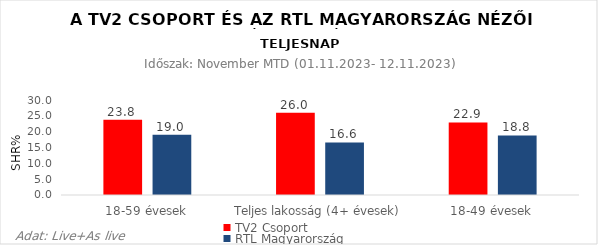
| Category | TV2 Csoport | RTL Magyarország |
|---|---|---|
| 18-59 évesek | 23.8 | 19 |
| Teljes lakosság (4+ évesek) | 26 | 16.6 |
| 18-49 évesek | 22.9 | 18.8 |